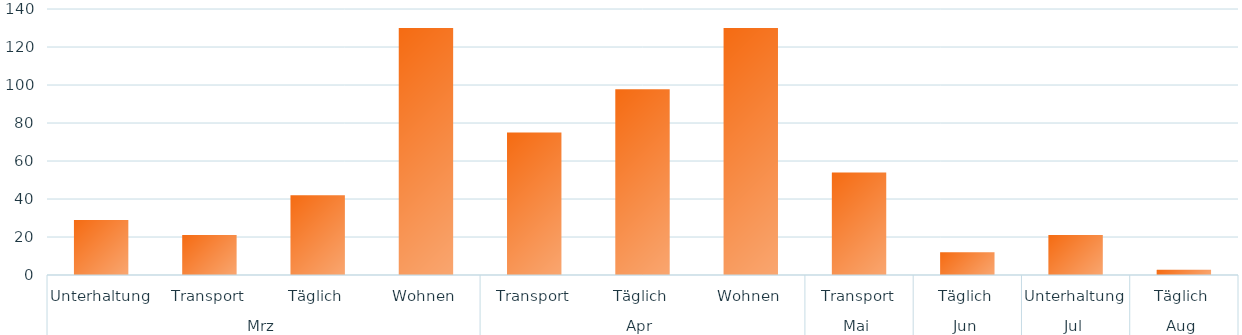
| Category | Ergebnis |
|---|---|
| 0 | 29 |
| 1 | 21 |
| 2 | 42 |
| 3 | 130 |
| 4 | 75 |
| 5 | 97.75 |
| 6 | 130 |
| 7 | 54 |
| 8 | 12 |
| 9 | 21 |
| 10 | 2.75 |